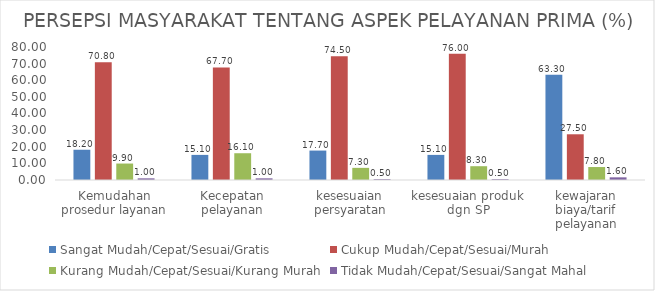
| Category | Sangat Mudah/Cepat/Sesuai/Gratis | Cukup Mudah/Cepat/Sesuai/Murah | Kurang Mudah/Cepat/Sesuai/Kurang Murah | Tidak Mudah/Cepat/Sesuai/Sangat Mahal |
|---|---|---|---|---|
| Kemudahan prosedur layanan | 18.2 | 70.8 | 9.9 | 1 |
| Kecepatan pelayanan | 15.1 | 67.7 | 16.1 | 1 |
| kesesuaian persyaratan | 17.7 | 74.5 | 7.3 | 0.5 |
| kesesuaian produk dgn SP | 15.1 | 76 | 8.3 | 0.5 |
| kewajaran biaya/tarif pelayanan | 63.3 | 27.5 | 7.8 | 1.6 |